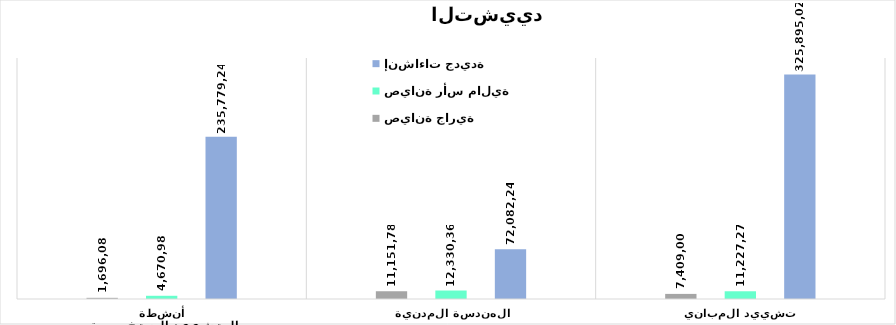
| Category | إنشاءات جديدة     | صيانة رأس مالية     | صيانة جارية        |
|---|---|---|---|
| تشييد المباني | 325895026.8 | 11227279.35 | 7409006.85 |
| الهندسة المدنية | 72082239.6 | 12330365.25 | 11151784.35 |
| أنشطة التشييد المتخصصة | 235779248.25 | 4670982.75 | 1696088.1 |